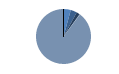
| Category | Series 0 |
|---|---|
| ARRASTRE | 23 |
| CERCO | 20 |
| PALANGRE | 11 |
| REDES DE ENMALLE | 0 |
| ARTES FIJAS | 1 |
| ARTES MENORES | 482 |
| SIN TIPO ASIGNADO | 0 |